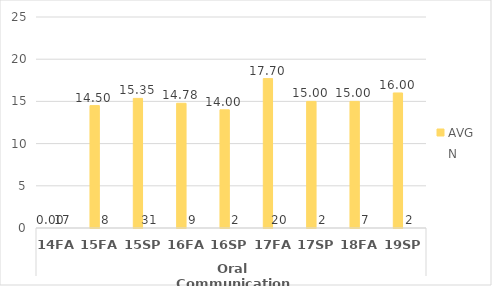
| Category | Human Services - AVG | Human Services - N |
|---|---|---|
| 0 | 0 | 17 |
| 1 | 14.5 | 8 |
| 2 | 15.355 | 31 |
| 3 | 14.778 | 9 |
| 4 | 14 | 2 |
| 5 | 17.7 | 20 |
| 6 | 15 | 2 |
| 7 | 15 | 7 |
| 8 | 16 | 2 |